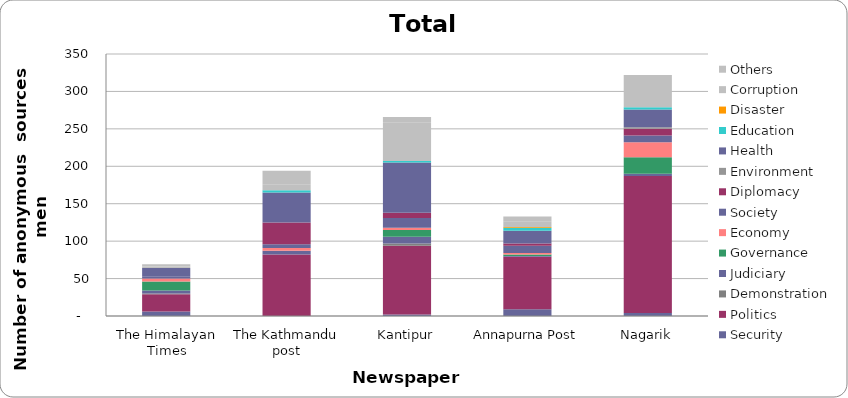
| Category | Security | Politics | Demonstration | Judiciary | Governance | Economy | Society | Diplomacy | Environment | Health | Education | Disaster | Corruption | Others |
|---|---|---|---|---|---|---|---|---|---|---|---|---|---|---|
| The Himalayan Times | 6 | 23 | 1 | 4 | 12 | 4 | 3 | 0 | 0 | 11 | 0 | 0 | 2 | 3 |
| The Kathmandu post | 0 | 82 | 0 | 5 | 0 | 4 | 5 | 29 | 0 | 40 | 3 | 0 | 8 | 18 |
| Kantipur | 2 | 92 | 3 | 9 | 9 | 3 | 13 | 7 | 0 | 67 | 2 | 0 | 51 | 8 |
| Annapurna Post | 9 | 70 | 0 | 1 | 2 | 2 | 10 | 3 | 0 | 17 | 4 | 1 | 7 | 7 |
| Nagarik | 4 | 183 | 0 | 3 | 22 | 20 | 9 | 9 | 2 | 24 | 3 | 0 | 43 | 0 |